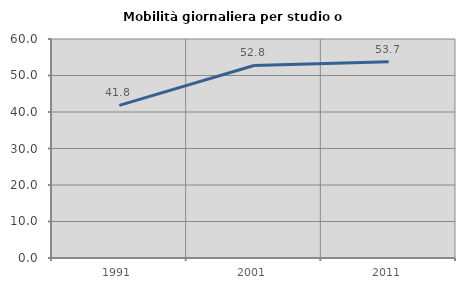
| Category | Mobilità giornaliera per studio o lavoro |
|---|---|
| 1991.0 | 41.817 |
| 2001.0 | 52.753 |
| 2011.0 | 53.744 |